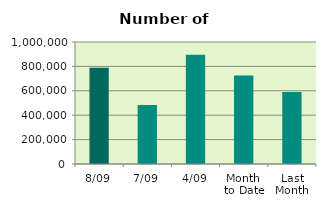
| Category | Series 0 |
|---|---|
| 8/09 | 788376 |
| 7/09 | 484616 |
| 4/09 | 895558 |
| Month 
to Date | 724647.667 |
| Last
Month | 590023.333 |